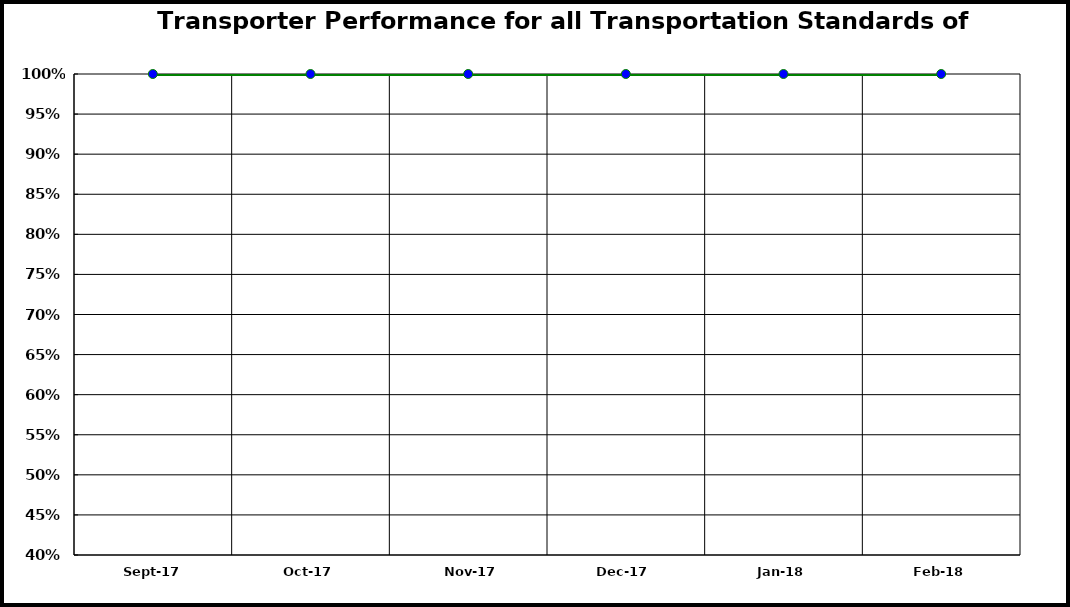
| Category | Performance |
|---|---|
| 2017-09-01 | 1 |
| 2017-10-01 | 1 |
| 2017-11-01 | 1 |
| 2017-12-01 | 1 |
| 2018-01-01 | 1 |
| 2018-02-01 | 1 |